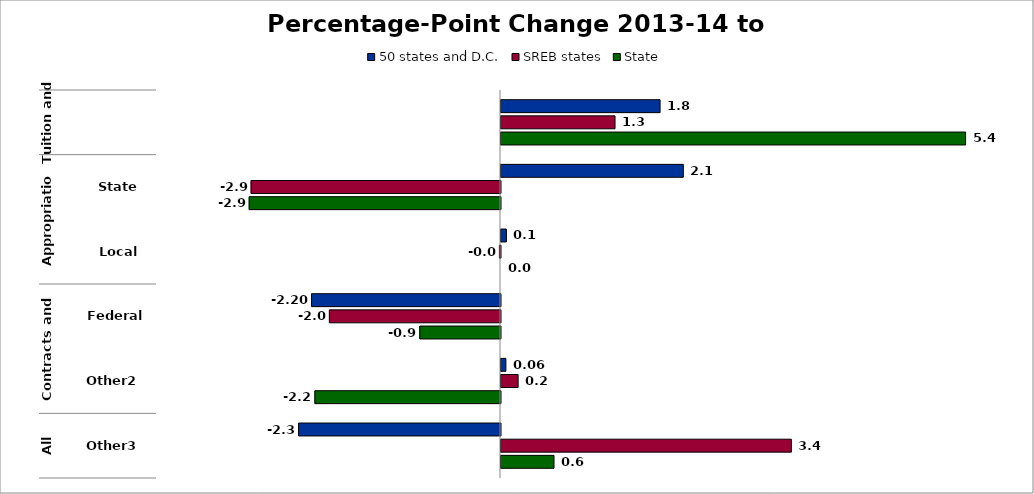
| Category | 50 states and D.C. | SREB states | State |
|---|---|---|---|
| 0 | 1.85 | 1.326 | 5.402 |
| 1 | 2.12 | -2.9 | -2.922 |
| 2 | 0.063 | -0.012 | 0 |
| 3 | -2.197 | -1.989 | -0.938 |
| 4 | 0.057 | 0.199 | -2.158 |
| 5 | -2.348 | 3.377 | 0.616 |